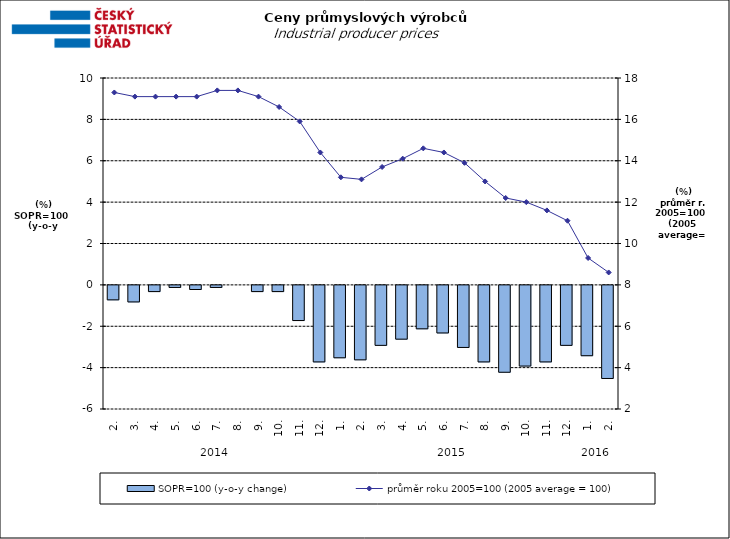
| Category | SOPR=100 (y-o-y change)   |
|---|---|
| 0 | -0.7 |
| 1 | -0.8 |
| 2 | -0.3 |
| 3 | -0.1 |
| 4 | -0.2 |
| 5 | -0.1 |
| 6 | 0 |
| 7 | -0.3 |
| 8 | -0.3 |
| 9 | -1.7 |
| 10 | -3.7 |
| 11 | -3.5 |
| 12 | -3.6 |
| 13 | -2.9 |
| 14 | -2.6 |
| 15 | -2.1 |
| 16 | -2.3 |
| 17 | -3 |
| 18 | -3.7 |
| 19 | -4.2 |
| 20 | -3.9 |
| 21 | -3.7 |
| 22 | -2.9 |
| 23 | -3.4 |
| 24 | -4.5 |